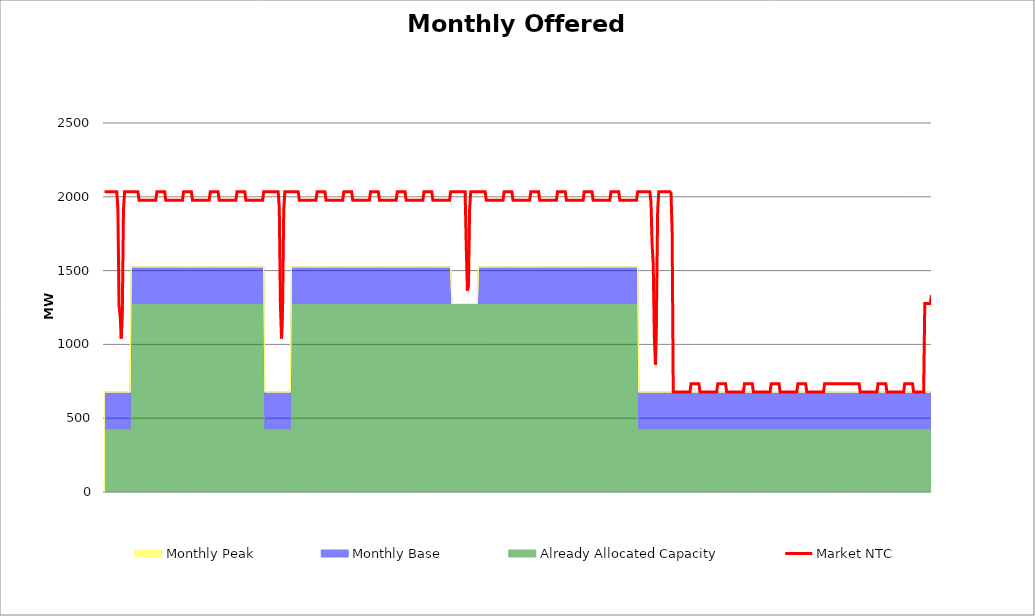
| Category | Market NTC |
|---|---|
| 0 | 2034 |
| 1 | 2034 |
| 2 | 2034 |
| 3 | 2034 |
| 4 | 2034 |
| 5 | 2034 |
| 6 | 2034 |
| 7 | 2034 |
| 8 | 2034 |
| 9 | 2034 |
| 10 | 2034 |
| 11 | 2034 |
| 12 | 1913 |
| 13 | 1261 |
| 14 | 1195 |
| 15 | 1040 |
| 16 | 1261 |
| 17 | 1913 |
| 18 | 2034 |
| 19 | 2034 |
| 20 | 2034 |
| 21 | 2034 |
| 22 | 2034 |
| 23 | 2034 |
| 24 | 2034 |
| 25 | 2034 |
| 26 | 2034 |
| 27 | 2034 |
| 28 | 2034 |
| 29 | 2034 |
| 30 | 2034 |
| 31 | 1977 |
| 32 | 1977 |
| 33 | 1977 |
| 34 | 1977 |
| 35 | 1977 |
| 36 | 1977 |
| 37 | 1977 |
| 38 | 1977 |
| 39 | 1977 |
| 40 | 1977 |
| 41 | 1977 |
| 42 | 1977 |
| 43 | 1977 |
| 44 | 1977 |
| 45 | 1977 |
| 46 | 1977 |
| 47 | 2034 |
| 48 | 2034 |
| 49 | 2034 |
| 50 | 2034 |
| 51 | 2034 |
| 52 | 2034 |
| 53 | 2034 |
| 54 | 2034 |
| 55 | 1977 |
| 56 | 1977 |
| 57 | 1977 |
| 58 | 1977 |
| 59 | 1977 |
| 60 | 1977 |
| 61 | 1977 |
| 62 | 1977 |
| 63 | 1977 |
| 64 | 1977 |
| 65 | 1977 |
| 66 | 1977 |
| 67 | 1977 |
| 68 | 1977 |
| 69 | 1977 |
| 70 | 1977 |
| 71 | 2034 |
| 72 | 2034 |
| 73 | 2034 |
| 74 | 2034 |
| 75 | 2034 |
| 76 | 2034 |
| 77 | 2034 |
| 78 | 2034 |
| 79 | 1977 |
| 80 | 1977 |
| 81 | 1977 |
| 82 | 1977 |
| 83 | 1977 |
| 84 | 1977 |
| 85 | 1977 |
| 86 | 1977 |
| 87 | 1977 |
| 88 | 1977 |
| 89 | 1977 |
| 90 | 1977 |
| 91 | 1977 |
| 92 | 1977 |
| 93 | 1977 |
| 94 | 1977 |
| 95 | 2034 |
| 96 | 2034 |
| 97 | 2034 |
| 98 | 2034 |
| 99 | 2034 |
| 100 | 2034 |
| 101 | 2034 |
| 102 | 2034 |
| 103 | 1977 |
| 104 | 1977 |
| 105 | 1977 |
| 106 | 1977 |
| 107 | 1977 |
| 108 | 1977 |
| 109 | 1977 |
| 110 | 1977 |
| 111 | 1977 |
| 112 | 1977 |
| 113 | 1977 |
| 114 | 1977 |
| 115 | 1977 |
| 116 | 1977 |
| 117 | 1977 |
| 118 | 1977 |
| 119 | 2034 |
| 120 | 2034 |
| 121 | 2034 |
| 122 | 2034 |
| 123 | 2034 |
| 124 | 2034 |
| 125 | 2034 |
| 126 | 2034 |
| 127 | 1977 |
| 128 | 1977 |
| 129 | 1977 |
| 130 | 1977 |
| 131 | 1977 |
| 132 | 1977 |
| 133 | 1977 |
| 134 | 1977 |
| 135 | 1977 |
| 136 | 1977 |
| 137 | 1977 |
| 138 | 1977 |
| 139 | 1977 |
| 140 | 1977 |
| 141 | 1977 |
| 142 | 1977 |
| 143 | 2034 |
| 144 | 2034 |
| 145 | 2034 |
| 146 | 2034 |
| 147 | 2034 |
| 148 | 2034 |
| 149 | 2034 |
| 150 | 2034 |
| 151 | 2034 |
| 152 | 2034 |
| 153 | 2034 |
| 154 | 2034 |
| 155 | 2034 |
| 156 | 2034 |
| 157 | 1928 |
| 158 | 1276 |
| 159 | 1040 |
| 160 | 1273 |
| 161 | 1913 |
| 162 | 2034 |
| 163 | 2034 |
| 164 | 2034 |
| 165 | 2034 |
| 166 | 2034 |
| 167 | 2034 |
| 168 | 2034 |
| 169 | 2034 |
| 170 | 2034 |
| 171 | 2034 |
| 172 | 2034 |
| 173 | 2034 |
| 174 | 2034 |
| 175 | 1977 |
| 176 | 1977 |
| 177 | 1977 |
| 178 | 1977 |
| 179 | 1977 |
| 180 | 1977 |
| 181 | 1977 |
| 182 | 1977 |
| 183 | 1977 |
| 184 | 1977 |
| 185 | 1977 |
| 186 | 1977 |
| 187 | 1977 |
| 188 | 1977 |
| 189 | 1977 |
| 190 | 1977 |
| 191 | 2034 |
| 192 | 2034 |
| 193 | 2034 |
| 194 | 2034 |
| 195 | 2034 |
| 196 | 2034 |
| 197 | 2034 |
| 198 | 2034 |
| 199 | 1977 |
| 200 | 1977 |
| 201 | 1977 |
| 202 | 1977 |
| 203 | 1977 |
| 204 | 1977 |
| 205 | 1977 |
| 206 | 1977 |
| 207 | 1977 |
| 208 | 1977 |
| 209 | 1977 |
| 210 | 1977 |
| 211 | 1977 |
| 212 | 1977 |
| 213 | 1977 |
| 214 | 1977 |
| 215 | 2034 |
| 216 | 2034 |
| 217 | 2034 |
| 218 | 2034 |
| 219 | 2034 |
| 220 | 2034 |
| 221 | 2034 |
| 222 | 2034 |
| 223 | 1977 |
| 224 | 1977 |
| 225 | 1977 |
| 226 | 1977 |
| 227 | 1977 |
| 228 | 1977 |
| 229 | 1977 |
| 230 | 1977 |
| 231 | 1977 |
| 232 | 1977 |
| 233 | 1977 |
| 234 | 1977 |
| 235 | 1977 |
| 236 | 1977 |
| 237 | 1977 |
| 238 | 1977 |
| 239 | 2034 |
| 240 | 2034 |
| 241 | 2034 |
| 242 | 2034 |
| 243 | 2034 |
| 244 | 2034 |
| 245 | 2034 |
| 246 | 2034 |
| 247 | 1977 |
| 248 | 1977 |
| 249 | 1977 |
| 250 | 1977 |
| 251 | 1977 |
| 252 | 1977 |
| 253 | 1977 |
| 254 | 1977 |
| 255 | 1977 |
| 256 | 1977 |
| 257 | 1977 |
| 258 | 1977 |
| 259 | 1977 |
| 260 | 1977 |
| 261 | 1977 |
| 262 | 1977 |
| 263 | 2034 |
| 264 | 2034 |
| 265 | 2034 |
| 266 | 2034 |
| 267 | 2034 |
| 268 | 2034 |
| 269 | 2034 |
| 270 | 2034 |
| 271 | 1977 |
| 272 | 1977 |
| 273 | 1977 |
| 274 | 1977 |
| 275 | 1977 |
| 276 | 1977 |
| 277 | 1977 |
| 278 | 1977 |
| 279 | 1977 |
| 280 | 1977 |
| 281 | 1977 |
| 282 | 1977 |
| 283 | 1977 |
| 284 | 1977 |
| 285 | 1977 |
| 286 | 1977 |
| 287 | 2034 |
| 288 | 2034 |
| 289 | 2034 |
| 290 | 2034 |
| 291 | 2034 |
| 292 | 2034 |
| 293 | 2034 |
| 294 | 2034 |
| 295 | 1977 |
| 296 | 1977 |
| 297 | 1977 |
| 298 | 1977 |
| 299 | 1977 |
| 300 | 1977 |
| 301 | 1977 |
| 302 | 1977 |
| 303 | 1977 |
| 304 | 1977 |
| 305 | 1977 |
| 306 | 1977 |
| 307 | 1977 |
| 308 | 1977 |
| 309 | 1977 |
| 310 | 1977 |
| 311 | 2034 |
| 312 | 2034 |
| 313 | 2034 |
| 314 | 2034 |
| 315 | 2034 |
| 316 | 2034 |
| 317 | 2034 |
| 318 | 2034 |
| 319 | 2034 |
| 320 | 2034 |
| 321 | 2034 |
| 322 | 2034 |
| 323 | 2034 |
| 324 | 2034 |
| 325 | 1668 |
| 326 | 1365 |
| 327 | 1405 |
| 328 | 1913 |
| 329 | 2034 |
| 330 | 2034 |
| 331 | 2034 |
| 332 | 2034 |
| 333 | 2034 |
| 334 | 2034 |
| 335 | 2034 |
| 336 | 2034 |
| 337 | 2034 |
| 338 | 2034 |
| 339 | 2034 |
| 340 | 2034 |
| 341 | 2034 |
| 342 | 2034 |
| 343 | 1977 |
| 344 | 1977 |
| 345 | 1977 |
| 346 | 1977 |
| 347 | 1977 |
| 348 | 1977 |
| 349 | 1977 |
| 350 | 1977 |
| 351 | 1977 |
| 352 | 1977 |
| 353 | 1977 |
| 354 | 1977 |
| 355 | 1977 |
| 356 | 1977 |
| 357 | 1977 |
| 358 | 1977 |
| 359 | 2034 |
| 360 | 2034 |
| 361 | 2034 |
| 362 | 2034 |
| 363 | 2034 |
| 364 | 2034 |
| 365 | 2034 |
| 366 | 2034 |
| 367 | 1977 |
| 368 | 1977 |
| 369 | 1977 |
| 370 | 1977 |
| 371 | 1977 |
| 372 | 1977 |
| 373 | 1977 |
| 374 | 1977 |
| 375 | 1977 |
| 376 | 1977 |
| 377 | 1977 |
| 378 | 1977 |
| 379 | 1977 |
| 380 | 1977 |
| 381 | 1977 |
| 382 | 1977 |
| 383 | 2034 |
| 384 | 2034 |
| 385 | 2034 |
| 386 | 2034 |
| 387 | 2034 |
| 388 | 2034 |
| 389 | 2034 |
| 390 | 2034 |
| 391 | 1977 |
| 392 | 1977 |
| 393 | 1977 |
| 394 | 1977 |
| 395 | 1977 |
| 396 | 1977 |
| 397 | 1977 |
| 398 | 1977 |
| 399 | 1977 |
| 400 | 1977 |
| 401 | 1977 |
| 402 | 1977 |
| 403 | 1977 |
| 404 | 1977 |
| 405 | 1977 |
| 406 | 1977 |
| 407 | 2034 |
| 408 | 2034 |
| 409 | 2034 |
| 410 | 2034 |
| 411 | 2034 |
| 412 | 2034 |
| 413 | 2034 |
| 414 | 2034 |
| 415 | 1977 |
| 416 | 1977 |
| 417 | 1977 |
| 418 | 1977 |
| 419 | 1977 |
| 420 | 1977 |
| 421 | 1977 |
| 422 | 1977 |
| 423 | 1977 |
| 424 | 1977 |
| 425 | 1977 |
| 426 | 1977 |
| 427 | 1977 |
| 428 | 1977 |
| 429 | 1977 |
| 430 | 1977 |
| 431 | 2034 |
| 432 | 2034 |
| 433 | 2034 |
| 434 | 2034 |
| 435 | 2034 |
| 436 | 2034 |
| 437 | 2034 |
| 438 | 2034 |
| 439 | 1977 |
| 440 | 1977 |
| 441 | 1977 |
| 442 | 1977 |
| 443 | 1977 |
| 444 | 1977 |
| 445 | 1977 |
| 446 | 1977 |
| 447 | 1977 |
| 448 | 1977 |
| 449 | 1977 |
| 450 | 1977 |
| 451 | 1977 |
| 452 | 1977 |
| 453 | 1977 |
| 454 | 1977 |
| 455 | 2034 |
| 456 | 2034 |
| 457 | 2034 |
| 458 | 2034 |
| 459 | 2034 |
| 460 | 2034 |
| 461 | 2034 |
| 462 | 2034 |
| 463 | 1977 |
| 464 | 1977 |
| 465 | 1977 |
| 466 | 1977 |
| 467 | 1977 |
| 468 | 1977 |
| 469 | 1977 |
| 470 | 1977 |
| 471 | 1977 |
| 472 | 1977 |
| 473 | 1977 |
| 474 | 1977 |
| 475 | 1977 |
| 476 | 1977 |
| 477 | 1977 |
| 478 | 1977 |
| 479 | 2034 |
| 480 | 2034 |
| 481 | 2034 |
| 482 | 2034 |
| 483 | 2034 |
| 484 | 2034 |
| 485 | 2034 |
| 486 | 2034 |
| 487 | 2034 |
| 488 | 2034 |
| 489 | 2034 |
| 490 | 2034 |
| 491 | 1962 |
| 492 | 1679 |
| 493 | 1546 |
| 494 | 1052 |
| 495 | 863 |
| 496 | 1261 |
| 497 | 1913 |
| 498 | 2034 |
| 499 | 2034 |
| 500 | 2034 |
| 501 | 2034 |
| 502 | 2034 |
| 503 | 2034 |
| 504 | 2034 |
| 505 | 2034 |
| 506 | 2034 |
| 507 | 2034 |
| 508 | 2034 |
| 509 | 2025 |
| 510 | 1761 |
| 511 | 677 |
| 512 | 677 |
| 513 | 677 |
| 514 | 677 |
| 515 | 677 |
| 516 | 677 |
| 517 | 677 |
| 518 | 677 |
| 519 | 677 |
| 520 | 677 |
| 521 | 677 |
| 522 | 677 |
| 523 | 677 |
| 524 | 677 |
| 525 | 677 |
| 526 | 677 |
| 527 | 734 |
| 528 | 734 |
| 529 | 734 |
| 530 | 734 |
| 531 | 734 |
| 532 | 734 |
| 533 | 734 |
| 534 | 734 |
| 535 | 677 |
| 536 | 677 |
| 537 | 677 |
| 538 | 677 |
| 539 | 677 |
| 540 | 677 |
| 541 | 677 |
| 542 | 677 |
| 543 | 677 |
| 544 | 677 |
| 545 | 677 |
| 546 | 677 |
| 547 | 677 |
| 548 | 677 |
| 549 | 677 |
| 550 | 677 |
| 551 | 734 |
| 552 | 734 |
| 553 | 734 |
| 554 | 734 |
| 555 | 734 |
| 556 | 734 |
| 557 | 734 |
| 558 | 734 |
| 559 | 677 |
| 560 | 677 |
| 561 | 677 |
| 562 | 677 |
| 563 | 677 |
| 564 | 677 |
| 565 | 677 |
| 566 | 677 |
| 567 | 677 |
| 568 | 677 |
| 569 | 677 |
| 570 | 677 |
| 571 | 677 |
| 572 | 677 |
| 573 | 677 |
| 574 | 677 |
| 575 | 734 |
| 576 | 734 |
| 577 | 734 |
| 578 | 734 |
| 579 | 734 |
| 580 | 734 |
| 581 | 734 |
| 582 | 734 |
| 583 | 677 |
| 584 | 677 |
| 585 | 677 |
| 586 | 677 |
| 587 | 677 |
| 588 | 677 |
| 589 | 677 |
| 590 | 677 |
| 591 | 677 |
| 592 | 677 |
| 593 | 677 |
| 594 | 677 |
| 595 | 677 |
| 596 | 677 |
| 597 | 677 |
| 598 | 677 |
| 599 | 734 |
| 600 | 734 |
| 601 | 734 |
| 602 | 734 |
| 603 | 734 |
| 604 | 734 |
| 605 | 734 |
| 606 | 734 |
| 607 | 677 |
| 608 | 677 |
| 609 | 677 |
| 610 | 677 |
| 611 | 677 |
| 612 | 677 |
| 613 | 677 |
| 614 | 677 |
| 615 | 677 |
| 616 | 677 |
| 617 | 677 |
| 618 | 677 |
| 619 | 677 |
| 620 | 677 |
| 621 | 677 |
| 622 | 677 |
| 623 | 734 |
| 624 | 734 |
| 625 | 734 |
| 626 | 734 |
| 627 | 734 |
| 628 | 734 |
| 629 | 734 |
| 630 | 734 |
| 631 | 677 |
| 632 | 677 |
| 633 | 677 |
| 634 | 677 |
| 635 | 677 |
| 636 | 677 |
| 637 | 677 |
| 638 | 677 |
| 639 | 677 |
| 640 | 677 |
| 641 | 677 |
| 642 | 677 |
| 643 | 677 |
| 644 | 677 |
| 645 | 677 |
| 646 | 677 |
| 647 | 734 |
| 648 | 734 |
| 649 | 734 |
| 650 | 734 |
| 651 | 734 |
| 652 | 734 |
| 653 | 734 |
| 654 | 734 |
| 655 | 734 |
| 656 | 734 |
| 657 | 734 |
| 658 | 734 |
| 659 | 734 |
| 660 | 734 |
| 661 | 734 |
| 662 | 734 |
| 663 | 734 |
| 664 | 734 |
| 665 | 734 |
| 666 | 734 |
| 667 | 734 |
| 668 | 734 |
| 669 | 734 |
| 670 | 734 |
| 671 | 734 |
| 672 | 734 |
| 673 | 734 |
| 674 | 734 |
| 675 | 734 |
| 676 | 734 |
| 677 | 734 |
| 678 | 734 |
| 679 | 677 |
| 680 | 677 |
| 681 | 677 |
| 682 | 677 |
| 683 | 677 |
| 684 | 677 |
| 685 | 677 |
| 686 | 677 |
| 687 | 677 |
| 688 | 677 |
| 689 | 677 |
| 690 | 677 |
| 691 | 677 |
| 692 | 677 |
| 693 | 677 |
| 694 | 677 |
| 695 | 734 |
| 696 | 734 |
| 697 | 734 |
| 698 | 734 |
| 699 | 734 |
| 700 | 734 |
| 701 | 734 |
| 702 | 734 |
| 703 | 677 |
| 704 | 677 |
| 705 | 677 |
| 706 | 677 |
| 707 | 677 |
| 708 | 677 |
| 709 | 677 |
| 710 | 677 |
| 711 | 677 |
| 712 | 677 |
| 713 | 677 |
| 714 | 677 |
| 715 | 677 |
| 716 | 677 |
| 717 | 677 |
| 718 | 677 |
| 719 | 734 |
| 720 | 734 |
| 721 | 734 |
| 722 | 734 |
| 723 | 734 |
| 724 | 734 |
| 725 | 734 |
| 726 | 734 |
| 727 | 677 |
| 728 | 677 |
| 729 | 677 |
| 730 | 677 |
| 731 | 677 |
| 732 | 677 |
| 733 | 677 |
| 734 | 677 |
| 735 | 677 |
| 736 | 677 |
| 737 | 1277 |
| 738 | 1277 |
| 739 | 1277 |
| 740 | 1277 |
| 741 | 1277 |
| 742 | 1277 |
| 743 | 1334 |